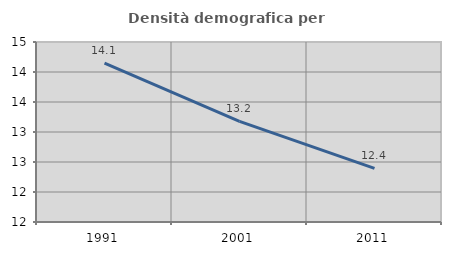
| Category | Densità demografica |
|---|---|
| 1991.0 | 14.149 |
| 2001.0 | 13.177 |
| 2011.0 | 12.392 |